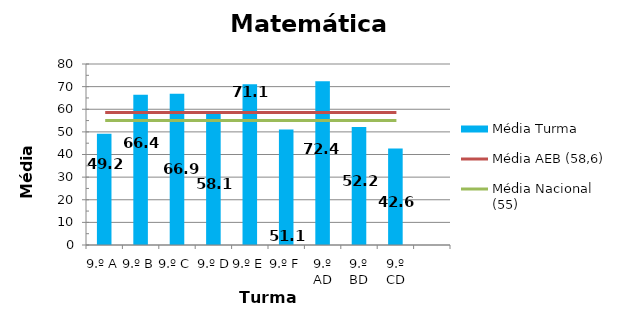
| Category | Média Turma |
|---|---|
| 9.º A | 49.19 |
| 9.º B | 66.44 |
| 9.º C | 66.89 |
| 9.º D | 58.06 |
| 9.º E | 71.08 |
| 9.º F | 51.09 |
| 9.º AD | 72.41 |
| 9.º BD | 52.19 |
| 9.º CD | 42.6 |